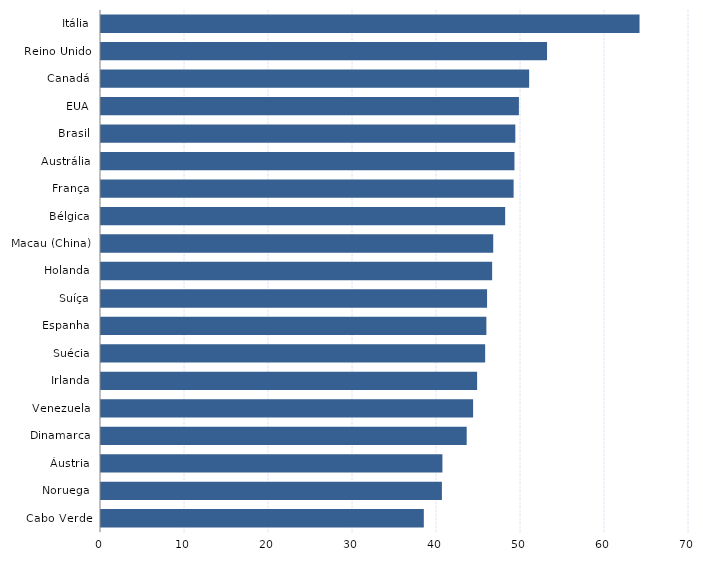
| Category | Series 0 |
|---|---|
| Cabo Verde | 38.431 |
| Noruega | 40.584 |
| Áustria | 40.644 |
| Dinamarca | 43.536 |
| Venezuela | 44.299 |
| Irlanda | 44.775 |
| Suécia | 45.733 |
| Espanha | 45.879 |
| Suíça | 45.961 |
| Holanda | 46.564 |
| Macau (China) | 46.693 |
| Bélgica | 48.116 |
| França | 49.122 |
| Austrália | 49.221 |
| Brasil | 49.325 |
| EUA | 49.751 |
| Canadá | 50.971 |
| Reino Unido | 53.1 |
| Itália | 64.11 |